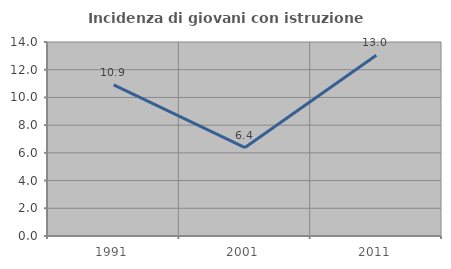
| Category | Incidenza di giovani con istruzione universitaria |
|---|---|
| 1991.0 | 10.909 |
| 2001.0 | 6.383 |
| 2011.0 | 13.043 |